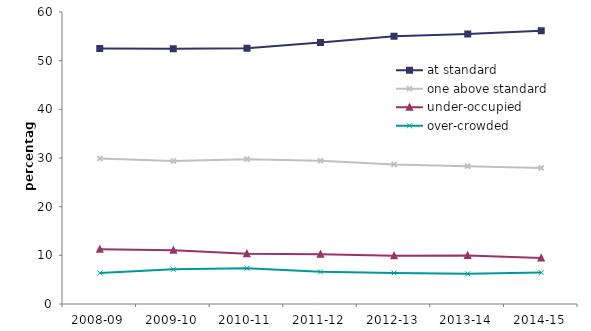
| Category | at standard | one above standard | under-occupied | over-crowded |
|---|---|---|---|---|
| 2008-09 | 52.491 | 29.902 | 11.237 | 6.37 |
| 2009-10 | 52.431 | 29.374 | 11.061 | 7.135 |
| 2010-11 | 52.566 | 29.764 | 10.327 | 7.342 |
| 2011-12 | 53.715 | 29.439 | 10.236 | 6.61 |
| 2012-13 | 55.037 | 28.672 | 9.905 | 6.386 |
| 2013-14 | 55.5 | 28.321 | 9.981 | 6.197 |
| 2014-15 | 56.146 | 27.966 | 9.441 | 6.447 |